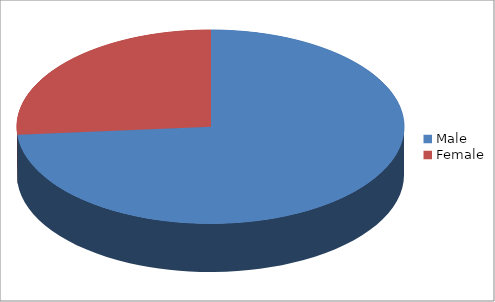
| Category | Series 0 |
|---|---|
| Male | 14 |
| Female | 5 |